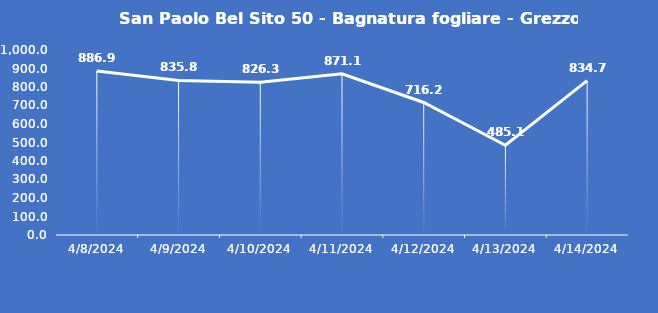
| Category | San Paolo Bel Sito 50 - Bagnatura fogliare - Grezzo (min) |
|---|---|
| 4/8/24 | 886.9 |
| 4/9/24 | 835.8 |
| 4/10/24 | 826.3 |
| 4/11/24 | 871.1 |
| 4/12/24 | 716.2 |
| 4/13/24 | 485.1 |
| 4/14/24 | 834.7 |